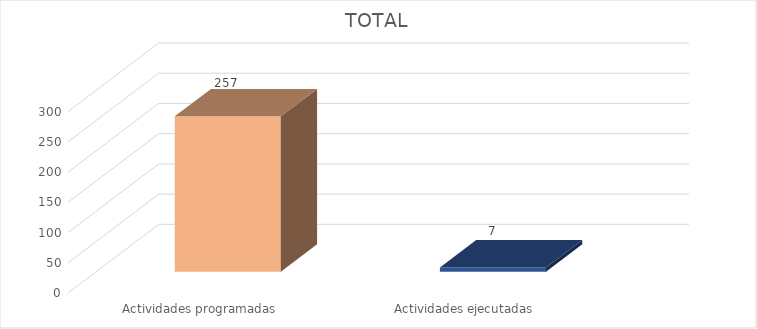
| Category | TOTAL |
|---|---|
| Actividades programadas | 257 |
| Actividades ejecutadas | 7 |